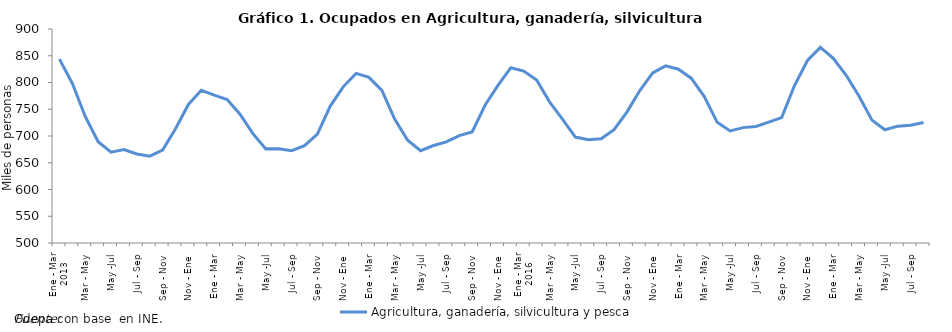
| Category | Agricultura, ganadería, silvicultura y pesca |
|---|---|
| 0 | 843.658 |
| 1 | 798.266 |
| 2 | 736.461 |
| 3 | 689.358 |
| 4 | 669.839 |
| 5 | 674.791 |
| 6 | 666.406 |
| 7 | 662.262 |
| 8 | 673.724 |
| 9 | 713.604 |
| 10 | 758.988 |
| 11 | 785.537 |
| 12 | 776.373 |
| 13 | 768.303 |
| 14 | 740.609 |
| 15 | 704.367 |
| 16 | 675.938 |
| 17 | 676.058 |
| 18 | 672.6 |
| 19 | 682.074 |
| 20 | 703.599 |
| 21 | 755.905 |
| 22 | 791.902 |
| 23 | 817.027 |
| 24 | 809.646 |
| 25 | 785.301 |
| 26 | 731.282 |
| 27 | 691.978 |
| 28 | 672.526 |
| 29 | 682.164 |
| 30 | 689.034 |
| 31 | 700.719 |
| 32 | 707.439 |
| 33 | 757.522 |
| 34 | 794.669 |
| 35 | 827.605 |
| 36 | 821.367 |
| 37 | 804.582 |
| 38 | 763.826 |
| 39 | 731.558 |
| 40 | 698.04 |
| 41 | 692.989 |
| 42 | 694.776 |
| 43 | 711.757 |
| 44 | 744.739 |
| 45 | 785.03 |
| 46 | 818.051 |
| 47 | 831.11 |
| 48 | 824.789 |
| 49 | 807.606 |
| 50 | 773.662 |
| 51 | 725.597 |
| 52 | 709.369 |
| 53 | 715.675 |
| 54 | 717.856 |
| 55 | 725.965 |
| 56 | 734.277 |
| 57 | 794.66 |
| 58 | 841.147 |
| 59 | 865.659 |
| 60 | 845.074 |
| 61 | 813.586 |
| 62 | 774.131 |
| 63 | 729.695 |
| 64 | 711.581 |
| 65 | 718.419 |
| 66 | 720.091 |
| 67 | 725.105 |